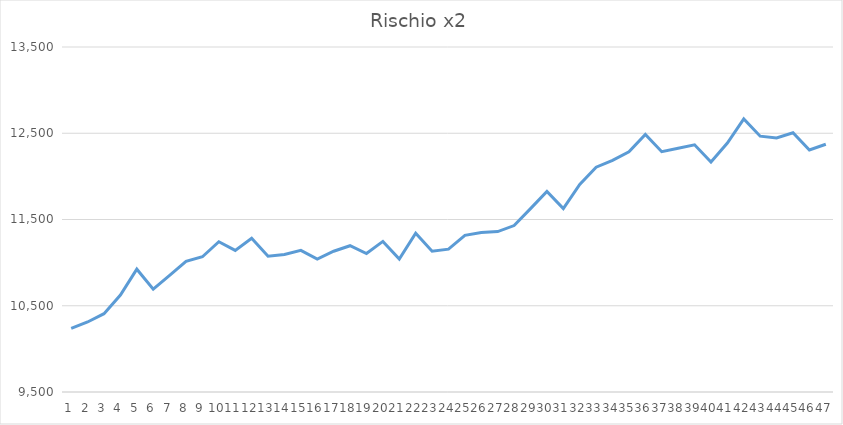
| Category | Series 0 |
|---|---|
| 0 | 10238 |
| 1 | 10312 |
| 2 | 10408 |
| 3 | 10624 |
| 4 | 10924 |
| 5 | 10692 |
| 6 | 10852 |
| 7 | 11014 |
| 8 | 11068 |
| 9 | 11242 |
| 10 | 11142 |
| 11 | 11282 |
| 12 | 11074 |
| 13 | 11094 |
| 14 | 11142 |
| 15 | 11042 |
| 16 | 11132 |
| 17 | 11196 |
| 18 | 11106 |
| 19 | 11246 |
| 20 | 11042 |
| 21 | 11342 |
| 22 | 11132 |
| 23 | 11156 |
| 24 | 11316 |
| 25 | 11348 |
| 26 | 11360 |
| 27 | 11430 |
| 28 | 11626 |
| 29 | 11826 |
| 30 | 11626 |
| 31 | 11906 |
| 32 | 12106 |
| 33 | 12186 |
| 34 | 12286 |
| 35 | 12486 |
| 36 | 12286 |
| 37 | 12326 |
| 38 | 12366 |
| 39 | 12166 |
| 40 | 12386 |
| 41 | 12666 |
| 42 | 12466 |
| 43 | 12446 |
| 44 | 12506 |
| 45 | 12306 |
| 46 | 12372 |